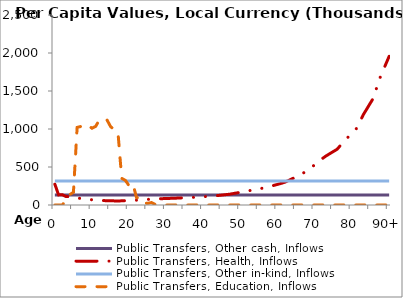
| Category | Public Transfers, Other cash, Inflows | Public Transfers, Health, Inflows | Public Transfers, Other in-kind, Inflows | Public Transfers, Education, Inflows |
|---|---|---|---|---|
| 0 | 133148.843 | 274084.917 | 315238.829 | 0 |
|  | 133148.843 | 133031.745 | 315238.829 | 0 |
| 2 | 133148.843 | 135396.265 | 315238.829 | 0 |
| 3 | 133148.843 | 110945.956 | 315238.829 | 60965.388 |
| 4 | 133148.843 | 110148.443 | 315238.829 | 136532.488 |
| 5 | 133148.843 | 110481.24 | 315238.829 | 166910.079 |
| 6 | 133148.843 | 96651.038 | 315238.829 | 1021488.235 |
| 7 | 133148.843 | 82894.616 | 315238.829 | 1033249.848 |
| 8 | 133148.843 | 78186.63 | 315238.829 | 1021573.266 |
| 9 | 133148.843 | 73505.615 | 315238.829 | 1047487.15 |
| 10 | 133148.843 | 68815.566 | 315238.829 | 1009762.522 |
| 11 | 133148.843 | 64125.887 | 315238.829 | 1035347.51 |
| 12 | 133148.843 | 59420.902 | 315238.829 | 1123377.503 |
| 13 | 133148.843 | 58101.996 | 315238.829 | 1121458.109 |
| 14 | 133148.843 | 56789.717 | 315238.829 | 1122707.883 |
| 15 | 133148.843 | 55484.976 | 315238.829 | 1032345.984 |
| 16 | 133148.843 | 54169.299 | 315238.829 | 988616.314 |
| 17 | 133148.843 | 52853.988 | 315238.829 | 950306.514 |
| 18 | 133148.843 | 54996.687 | 315238.829 | 350937.21 |
| 19 | 133148.843 | 57123.25 | 315238.829 | 323464.085 |
| 20 | 133148.843 | 59272.843 | 315238.829 | 251813.121 |
| 21 | 133148.843 | 61410.785 | 315238.829 | 279989.198 |
| 22 | 133148.843 | 63510.844 | 315238.829 | 96461.635 |
| 23 | 133148.843 | 66890.665 | 315238.829 | 96382.867 |
| 24 | 133148.843 | 70237.141 | 315238.829 | 23115.853 |
| 25 | 133148.843 | 73608.131 | 315238.829 | 22572.496 |
| 26 | 133148.843 | 76960.8 | 315238.829 | 31953.665 |
| 27 | 133148.843 | 80348.627 | 315238.829 | 7623.302 |
| 28 | 133148.843 | 82015.319 | 315238.829 | 0 |
| 29 | 133148.843 | 83664.719 | 315238.829 | 0 |
| 30 | 133148.843 | 85349.743 | 315238.829 | 0 |
| 31 | 133148.843 | 87025.957 | 315238.829 | 0 |
| 32 | 133148.843 | 88635.873 | 315238.829 | 0 |
| 33 | 133148.843 | 90898.692 | 315238.829 | 0 |
| 34 | 133148.843 | 93163.78 | 315238.829 | 0 |
| 35 | 133148.843 | 95414.772 | 315238.829 | 0 |
| 36 | 133148.843 | 97786.279 | 315238.829 | 0 |
| 37 | 133148.843 | 99948.825 | 315238.829 | 0 |
| 38 | 133148.843 | 102104.915 | 315238.829 | 0 |
| 39 | 133148.843 | 104194.518 | 315238.829 | 0 |
| 40 | 133148.843 | 110158.693 | 315238.829 | 0 |
| 41 | 133148.843 | 112267.931 | 315238.829 | 0 |
| 42 | 133148.843 | 114418.511 | 315238.829 | 0 |
| 43 | 133148.843 | 119954.598 | 315238.829 | 0 |
| 44 | 133148.843 | 125344.445 | 315238.829 | 0 |
| 45 | 133148.843 | 130818.634 | 315238.829 | 0 |
| 46 | 133148.843 | 136200.564 | 315238.829 | 0 |
| 47 | 133148.843 | 141626.003 | 315238.829 | 0 |
| 48 | 133148.843 | 150387.178 | 315238.829 | 0 |
| 49 | 133148.843 | 159116.244 | 315238.829 | 0 |
| 50 | 133148.843 | 167903.347 | 315238.829 | 0 |
| 51 | 133148.843 | 176673.527 | 315238.829 | 0 |
| 52 | 133148.843 | 185657.643 | 315238.829 | 0 |
| 53 | 133148.843 | 194498.21 | 315238.829 | 0 |
| 54 | 133148.843 | 203238.55 | 315238.829 | 0 |
| 55 | 133148.843 | 212286.302 | 315238.829 | 0 |
| 56 | 133148.843 | 221937.678 | 315238.829 | 0 |
| 57 | 133148.843 | 229464.337 | 315238.829 | 0 |
| 58 | 133148.843 | 245588.934 | 315238.829 | 0 |
| 59 | 133148.843 | 258958.179 | 315238.829 | 0 |
| 60 | 133148.843 | 271594.805 | 315238.829 | 0 |
| 61 | 133148.843 | 285619.753 | 315238.829 | 0 |
| 62 | 133148.843 | 301780.192 | 315238.829 | 0 |
| 63 | 133148.843 | 324112.405 | 315238.829 | 0 |
| 64 | 133148.843 | 347991.353 | 315238.829 | 0 |
| 65 | 133148.843 | 370746.677 | 315238.829 | 0 |
| 66 | 133148.843 | 393803.639 | 315238.829 | 0 |
| 67 | 133148.843 | 424113.024 | 315238.829 | 0 |
| 68 | 133148.843 | 461061.057 | 315238.829 | 0 |
| 69 | 133148.843 | 495499.608 | 315238.829 | 0 |
| 70 | 133148.843 | 529469.682 | 315238.829 | 0 |
| 71 | 133148.843 | 563376.548 | 315238.829 | 0 |
| 72 | 133148.843 | 610051.468 | 315238.829 | 0 |
| 73 | 133148.843 | 645181.127 | 315238.829 | 0 |
| 74 | 133148.843 | 674735.899 | 315238.829 | 0 |
| 75 | 133148.843 | 704199.239 | 315238.829 | 0 |
| 76 | 133148.843 | 733700.04 | 315238.829 | 0 |
| 77 | 133148.843 | 790249.526 | 315238.829 | 0 |
| 78 | 133148.843 | 847961.497 | 315238.829 | 0 |
| 79 | 133148.843 | 895307.925 | 315238.829 | 0 |
| 80 | 133148.843 | 943240.053 | 315238.829 | 0 |
| 81 | 133148.843 | 989754.662 | 315238.829 | 0 |
| 82 | 133148.843 | 1081623.311 | 315238.829 | 0 |
| 83 | 133148.843 | 1184700.193 | 315238.829 | 0 |
| 84 | 133148.843 | 1265012.478 | 315238.829 | 0 |
| 85 | 133148.843 | 1345768.22 | 315238.829 | 0 |
| 86 | 133148.843 | 1425823.878 | 315238.829 | 0 |
| 87 | 133148.843 | 1613096.554 | 315238.829 | 0 |
| 88 | 133148.843 | 1727436.009 | 315238.829 | 0 |
| 89 | 133148.843 | 1841775.464 | 315238.829 | 0 |
| 90+ | 133148.843 | 1956114.919 | 315238.829 | 0 |